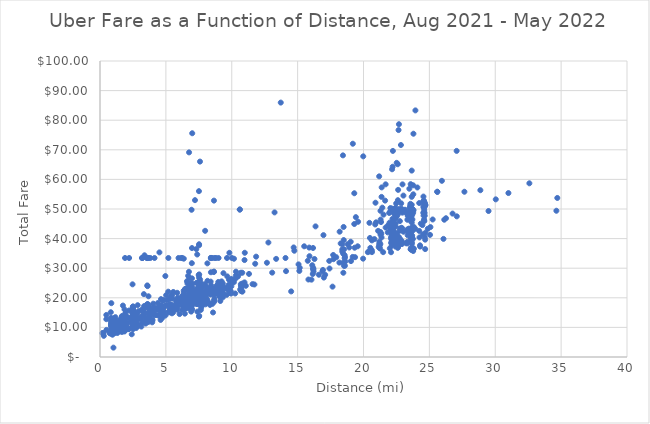
| Category |  Total Trip Fare in Local Currency  |
|---|---|
| 7.64 | 17.95 |
| 6.57 | 20.25 |
| 7.55 | 21.31 |
| 7.53 | 21.56 |
| 7.5 | 18.25 |
| 7.59 | 66.02 |
| 8.05 | 19.68 |
| 23.7 | 42.55 |
| 7.54 | 18.28 |
| 6.35 | 19.85 |
| 9.79 | 26.1 |
| 9.63 | 23.35 |
| 1.63 | 8.63 |
| 3.69 | 14.93 |
| 7.54 | 18.25 |
| 1.64 | 8.76 |
| 6.76 | 18.14 |
| 3.71 | 15.23 |
| 7.47 | 18.1 |
| 7.54 | 20.12 |
| 7.48 | 19.96 |
| 4.02 | 14.55 |
| 23.36 | 42.28 |
| 7.6 | 26.15 |
| 7.56 | 19.94 |
| 5.51 | 19.76 |
| 9.13 | 21.84 |
| 5.51 | 16.84 |
| 9.79 | 23.63 |
| 22.94 | 43.45 |
| 7.53 | 20.53 |
| 16.99 | 26.83 |
| 16.88 | 28.92 |
| 7.54 | 19.82 |
| 2.52 | 13.73 |
| 7.57 | 19.38 |
| 16.36 | 44.13 |
| 0.49 | 9.15 |
| 0.48 | 14.21 |
| 7.48 | 19.45 |
| 1.71 | 8.85 |
| 7.48 | 17.89 |
| 7.72 | 20.89 |
| 7.48 | 20.25 |
| 14.51 | 22.16 |
| 5.8 | 19.35 |
| 7.32 | 20.23 |
| 7.8 | 21.97 |
| 23.65 | 46.28 |
| 7.6 | 20.66 |
| 9.82 | 35.2 |
| 7.53 | 13.89 |
| 9.0 | 23.31 |
| 0.82 | 15.12 |
| 0.89 | 8.05 |
| 21.87 | 44.51 |
| 10.32 | 28.83 |
| 3.16 | 13.29 |
| 7.52 | 23.59 |
| 5.48 | 15.25 |
| 20.43 | 35.67 |
| 7.55 | 19.94 |
| 18.47 | 28.46 |
| 5.46 | 16.59 |
| 7.37 | 17.87 |
| 7.38 | 34.63 |
| 13.25 | 48.85 |
| 7.39 | 18.64 |
| 7.45 | 18.19 |
| 23.68 | 49.61 |
| 16.05 | 26.13 |
| 8.14 | 22.29 |
| 7.38 | 22.24 |
| 8.18 | 23 |
| 7.36 | 19.48 |
| 22.76 | 39.97 |
| 7.45 | 21.08 |
| 7.38 | 21.78 |
| 7.35 | 22.7 |
| 25.95 | 59.52 |
| 9.0 | 23.28 |
| 9.18 | 23.67 |
| 7.34 | 17.98 |
| 7.36 | 20.94 |
| 6.38 | 18.22 |
| 1.55 | 12.5 |
| 23.5 | 48.98 |
| 10.78 | 22.17 |
| 4.67 | 15.51 |
| 22.67 | 49.46 |
| 1.65 | 8.52 |
| 5.97 | 18.57 |
| 6.23 | 19.68 |
| 23.66 | 42.92 |
| 23.33 | 46.37 |
| 22.37 | 38.7 |
| 6.91 | 18.18 |
| 3.38 | 34.36 |
| 3.64 | 17.8 |
| 18.46 | 31.9 |
| 18.39 | 35.61 |
| 0.83 | 13.21 |
| 6.19 | 19.05 |
| 7.48 | 20.22 |
| 22.14 | 43.56 |
| 21.2 | 38.93 |
| 4.29 | 15.93 |
| 7.57 | 19.55 |
| 9.26 | 24.37 |
| 23.33 | 42.79 |
| 9.03 | 21.29 |
| 6.4 | 20.53 |
| 1.13 | 12.58 |
| 7.48 | 18.3 |
| 23.5 | 42.45 |
| 23.35 | 41.14 |
| 7.52 | 19.36 |
| 7.5 | 19.45 |
| 22.26 | 43.9 |
| 8.35 | 21.65 |
| 8.65 | 19.14 |
| 23.68 | 40.61 |
| 7.52 | 20.76 |
| 7.57 | 19.28 |
| 18.52 | 30.81 |
| 2.64 | 14.93 |
| 4.55 | 17.01 |
| 2.69 | 14.78 |
| 4.23 | 14.25 |
| 23.94 | 83.31 |
| 7.95 | 18.8 |
| 22.6 | 38.1 |
| 7.5 | 19.01 |
| 23.71 | 50.05 |
| 22.62 | 37.86 |
| 7.63 | 25.13 |
| 7.51 | 13.67 |
| 22.69 | 78.64 |
| 6.33 | 17.78 |
| 23.65 | 38.85 |
| 7.52 | 18.75 |
| 7.47 | 18.14 |
| 23.52 | 42.28 |
| 22.89 | 38.9 |
| 8.64 | 28.72 |
| 8.39 | 21.08 |
| 7.53 | 19.05 |
| 6.69 | 27.42 |
| 22.26 | 41.43 |
| 10.97 | 25.2 |
| 8.41 | 23.37 |
| 22.59 | 39.32 |
| 8.65 | 28.86 |
| 6.68 | 17.91 |
| 1.14 | 11.27 |
| 18.59 | 33.76 |
| 2.77 | 11.56 |
| 1.01 | 13.06 |
| 0.95 | 7.53 |
| 7.95 | 19.1 |
| 23.68 | 43.74 |
| 0.88 | 8.05 |
| 6.24 | 17.79 |
| 3.47 | 11.3 |
| 6.82 | 17.35 |
| 7.64 | 19.48 |
| 23.34 | 43.08 |
| 7.35 | 18.73 |
| 22.5 | 47.36 |
| 6.37 | 16.62 |
| 6.34 | 17.48 |
| 0.88 | 11.02 |
| 0.83 | 8.96 |
| 23.69 | 41.04 |
| 7.52 | 25.33 |
| 4.73 | 16.59 |
| 7.58 | 21.56 |
| 10.69 | 22.54 |
| 22.95 | 48.76 |
| 10.8 | 24.17 |
| 7.66 | 23.97 |
| 6.34 | 19.47 |
| 6.76 | 17.96 |
| 23.61 | 41.39 |
| 9.66 | 27.24 |
| 7.5 | 20.42 |
| 23.64 | 47.54 |
| 0.88 | 11.06 |
| 7.24 | 18.67 |
| 5.62 | 16.19 |
| 1.89 | 12.02 |
| 5.78 | 18.7 |
| 1.86 | 8.64 |
| 1.85 | 8.83 |
| 7.52 | 26.77 |
| 20.49 | 40.21 |
| 7.44 | 20.82 |
| 23.36 | 47.67 |
| 0.21 | 8.05 |
| 1.0 | 12.66 |
| 5.11 | 19.25 |
| 2.46 | 12.44 |
| 24.35 | 45.05 |
| 5.68 | 17.2 |
| 7.74 | 19.94 |
| 7.39 | 18.19 |
| 6.36 | 18.18 |
| 7.7 | 21.92 |
| 6.75 | 18.34 |
| 23.7 | 48.11 |
| 3.6 | 13.01 |
| 7.52 | 37.75 |
| 6.77 | 16.91 |
| 7.47 | 20.35 |
| 22.2 | 46.67 |
| 22.89 | 50.1 |
| 7.52 | 19.84 |
| 7.48 | 20.91 |
| 21.11 | 42.62 |
| 17.42 | 29.9 |
| 4.69 | 14.44 |
| 34.64 | 49.41 |
| 21.68 | 43.73 |
| 16.21 | 28.88 |
| 7.08 | 18.44 |
| 1.65 | 12.5 |
| 22.11 | 39.95 |
| 19.3 | 55.32 |
| 7.44 | 20.37 |
| 7.53 | 20.42 |
| 7.47 | 20.87 |
| 1.78 | 11.97 |
| 1.63 | 10.83 |
| 3.68 | 20.51 |
| 6.37 | 21.05 |
| 9.76 | 24.33 |
| 5.87 | 15.98 |
| 3.76 | 16.85 |
| 7.57 | 20.93 |
| 7.53 | 21.67 |
| 23.51 | 43.13 |
| 22.6 | 48.64 |
| 7.33 | 20.11 |
| 5.46 | 14.76 |
| 5.3 | 15.61 |
| 19.18 | 33.81 |
| 2.86 | 17.5 |
| 19.56 | 37.4 |
| 1.7 | 10.8 |
| 1.72 | 11.38 |
| 7.53 | 19.86 |
| 13.07 | 28.5 |
| 18.52 | 36.39 |
| 0.99 | 12.83 |
| 1.72 | 11.38 |
| 5.3 | 15.87 |
| 5.29 | 16.92 |
| 20.95 | 45.49 |
| 2.46 | 11.58 |
| 2.62 | 11.21 |
| 7.6 | 19.89 |
| 6.27 | 19.55 |
| 6.27 | 17.35 |
| 0.83 | 7.89 |
| 0.88 | 8.17 |
| 5.59 | 15.75 |
| 7.57 | 19.38 |
| 7.47 | 18.72 |
| 22.35 | 41.71 |
| 24.65 | 40.45 |
| 7.52 | 18.62 |
| 2.44 | 12.37 |
| 7.51 | 19.42 |
| 23.64 | 40.29 |
| 3.97 | 12.59 |
| 24.23 | 42.59 |
| 6.49 | 16.48 |
| 6.5 | 16.68 |
| 7.62 | 18.69 |
| 7.53 | 19.38 |
| 7.51 | 56.03 |
| 7.54 | 20.52 |
| 7.61 | 18.8 |
| 18.59 | 30.83 |
| 22.13 | 40.54 |
| 22.61 | 38.86 |
| 5.55 | 15.08 |
| 10.97 | 32.75 |
| 5.3 | 17.66 |
| 16.61 | 27.79 |
| 23.62 | 40.34 |
| 1.71 | 12.14 |
| 1.67 | 9.47 |
| 16.2 | 29.71 |
| 22.61 | 38.64 |
| 10.26 | 21.46 |
| 9.74 | 22.48 |
| 22.25 | 39.65 |
| 6.66 | 18.55 |
| 20.83 | 39.84 |
| 24.5 | 41.42 |
| 3.14 | 10.28 |
| 7.54 | 20.46 |
| 20.52 | 36.86 |
| 23.34 | 38.97 |
| 7.5 | 25.46 |
| 7.5 | 20.76 |
| 7.53 | 19.29 |
| 15.16 | 30.14 |
| 2.06 | 11.58 |
| 22.14 | 38.57 |
| 22.89 | 38.6 |
| 7.52 | 18.39 |
| 7.54 | 18.25 |
| 7.39 | 15.34 |
| 23.75 | 39.88 |
| 7.52 | 18.45 |
| 2.46 | 12.58 |
| 2.49 | 10.36 |
| 7.59 | 19.13 |
| 22.18 | 39.08 |
| 1.36 | 8.61 |
| 1.47 | 10.8 |
| 22.61 | 38.08 |
| 7.29 | 19.96 |
| 7.52 | 19.23 |
| 7.43 | 18.88 |
| 2.23 | 11.73 |
| 7.73 | 20.19 |
| 18.62 | 32.27 |
| 22.1 | 38.54 |
| 0.88 | 8.05 |
| 22.6 | 36.89 |
| 0.92 | 8.05 |
| 7.51 | 19.3 |
| 22.13 | 40.53 |
| 6.36 | 17.1 |
| 6.77 | 16.67 |
| 23.62 | 38.89 |
| 7.52 | 19.21 |
| 7.51 | 18.51 |
| 22.17 | 40.4 |
| 23.24 | 38.42 |
| 22.42 | 37.31 |
| 21.22 | 37.51 |
| 7.64 | 19.59 |
| 7.43 | 18.63 |
| 22.15 | 38.86 |
| 0.88 | 10.08 |
| 0.94 | 8.05 |
| 2.75 | 12.01 |
| 0.87 | 10.8 |
| 20.64 | 35.43 |
| 0.84 | 10.39 |
| 7.52 | 19.64 |
| 7.68 | 19.34 |
| 0.92 | 11.35 |
| 22.56 | 38.94 |
| 0.85 | 10.84 |
| 5.55 | 17.17 |
| 3.66 | 11.82 |
| 5.3 | 16.51 |
| 3.77 | 13.47 |
| 1.3 | 11.35 |
| 1.32 | 8.1 |
| 6.36 | 18.13 |
| 9.11 | 24.6 |
| 6.75 | 18.16 |
| 9.26 | 21.13 |
| 1.84 | 9.96 |
| 20.63 | 36.06 |
| 5.86 | 21.69 |
| 10.72 | 22.97 |
| 0.93 | 12.07 |
| 22.29 | 42.39 |
| 0.85 | 10.89 |
| 1.67 | 13.82 |
| 22.43 | 38.97 |
| 1.76 | 13.31 |
| 21.19 | 38.11 |
| 22.88 | 39.32 |
| 10.99 | 35.21 |
| 7.48 | 20.16 |
| 22.27 | 40.69 |
| 2.46 | 10.17 |
| 6.27 | 17.8 |
| 2.51 | 10.52 |
| 22.62 | 38.53 |
| 6.25 | 20.67 |
| 7.0 | 20.04 |
| 7.52 | 20.47 |
| 7.53 | 20.9 |
| 2.82 | 11.01 |
| 2.89 | 10.49 |
| 22.14 | 39.19 |
| 6.78 | 17.96 |
| 7.69 | 18.76 |
| 6.76 | 17.96 |
| 23.6 | 40.44 |
| 8.03 | 21.06 |
| 7.77 | 21.03 |
| 0.88 | 10.93 |
| 0.89 | 8.05 |
| 7.47 | 20.35 |
| 22.13 | 40.09 |
| 5.77 | 17.55 |
| 5.29 | 17.48 |
| 20.33 | 35.42 |
| 7.53 | 21.12 |
| 3.59 | 24.18 |
| 7.55 | 22.82 |
| 22.19 | 45.51 |
| 22.6 | 48.12 |
| 6.4 | 15.99 |
| 3.61 | 16.68 |
| 1.14 | 8.44 |
| 0.88 | 8.05 |
| 3.57 | 17.78 |
| 2.75 | 9.8 |
| 19.59 | 45.68 |
| 2.47 | 24.55 |
| 22.24 | 42.91 |
| 25.05 | 41.26 |
| 6.99 | 19.52 |
| 22.12 | 40.06 |
| 7.96 | 20.27 |
| 22.92 | 38.17 |
| 2.63 | 12.12 |
| 2.71 | 10.73 |
| 3.61 | 23.94 |
| 23.63 | 42.41 |
| 6.36 | 33.22 |
| 1.11 | 8.05 |
| 6.75 | 28.79 |
| 0.26 | 8.05 |
| 26.07 | 39.9 |
| 0.77 | 8.05 |
| 7.17 | 20.32 |
| 7.42 | 20.51 |
| 9.97 | 23.86 |
| 2.46 | 13.12 |
| 9.86 | 21.8 |
| 2.5 | 16.42 |
| 22.2 | 38.77 |
| 7.51 | 19.78 |
| 11.07 | 24.06 |
| 22.17 | 39.04 |
| 21.49 | 35.42 |
| 23.67 | 40.11 |
| 8.4 | 25.46 |
| 9.23 | 25.54 |
| 9.27 | 23.65 |
| 23.63 | 39.75 |
| 1.64 | 9.31 |
| 9.32 | 20.14 |
| 22.0 | 36.72 |
| 6.98 | 24.77 |
| 7.6 | 19.48 |
| 22.09 | 35.39 |
| 8.44 | 24.21 |
| 23.61 | 40.46 |
| 8.45 | 22.94 |
| 6.5 | 19.42 |
| 7.61 | 21.41 |
| 7.56 | 21.79 |
| 7.45 | 20.53 |
| 22.24 | 39.85 |
| 2.02 | 10.53 |
| 7.56 | 19.05 |
| 2.16 | 9.56 |
| 0.86 | 18.19 |
| 1.64 | 13 |
| 22.63 | 37.32 |
| 0.91 | 11.05 |
| 7.42 | 20.63 |
| 7.52 | 20.44 |
| 7.67 | 20.85 |
| 7.51 | 21.13 |
| 22.24 | 40.58 |
| 6.37 | 21.74 |
| 1.71 | 9.41 |
| 2.17 | 9.49 |
| 6.75 | 19.61 |
| 1.71 | 10.3 |
| 22.26 | 38.65 |
| 7.08 | 20.05 |
| 7.62 | 19.72 |
| 7.42 | 21.67 |
| 7.53 | 20.42 |
| 18.46 | 34.9 |
| 22.13 | 41.85 |
| 22.6 | 37.07 |
| 8.14 | 19.39 |
| 22.26 | 40.09 |
| 22.89 | 39.04 |
| 22.14 | 40.95 |
| 6.36 | 18.21 |
| 6.75 | 23.39 |
| 23.68 | 38.35 |
| 22.67 | 40.64 |
| 19.42 | 47.25 |
| 22.13 | 40.5 |
| 23.33 | 38.4 |
| 9.32 | 24.83 |
| 0.9 | 12.17 |
| 0.18 | 8.05 |
| 9.26 | 23.26 |
| 22.32 | 44.4 |
| 22.63 | 56.46 |
| 2.53 | 15.49 |
| 25.08 | 43.89 |
| 2.5 | 16.42 |
| 22.15 | 37.79 |
| 21.26 | 36.63 |
| 5.27 | 17.69 |
| 7.6 | 20.52 |
| 22.46 | 48.96 |
| 22.18 | 50.12 |
| 7.24 | 20.59 |
| 7.13 | 19.59 |
| 7.77 | 19.64 |
| 24.23 | 52.01 |
| 22.48 | 51.88 |
| 5.41 | 16.95 |
| 5.29 | 19.6 |
| 6.99 | 19.73 |
| 22.39 | 39.92 |
| 22.03 | 49.14 |
| 7.66 | 19.98 |
| 2.48 | 11.26 |
| 7.05 | 18.39 |
| 6.88 | 18.54 |
| 7.55 | 19.62 |
| 7.64 | 18.55 |
| 21.3 | 46.42 |
| 2.41 | 7.68 |
| 22.23 | 69.62 |
| 22.44 | 45.09 |
| 16.18 | 30.11 |
| 6.37 | 17.43 |
| 6.75 | 18.01 |
| 16.96 | 41.17 |
| 18.39 | 38.11 |
| 21.38 | 57.3 |
| 2.63 | 13.9 |
| 2.71 | 10.92 |
| 24.29 | 37.72 |
| 2.18 | 9.42 |
| 5.02 | 20.88 |
| 7.96 | 20.3 |
| 2.52 | 15.1 |
| 2.51 | 14.36 |
| 22.21 | 64.27 |
| 8.18 | 18.32 |
| 4.6 | 12.52 |
| 9.34 | 23.88 |
| 7.02 | 18.76 |
| 22.77 | 42.7 |
| 21.84 | 42.1 |
| 9.94 | 21.44 |
| 7.14 | 20.39 |
| 0.74 | 8.05 |
| 1.71 | 9.24 |
| 9.08 | 22.43 |
| 4.66 | 14.32 |
| 1.72 | 12.97 |
| 3.61 | 12.97 |
| 6.98 | 18.54 |
| 21.29 | 41.32 |
| 7.65 | 21.56 |
| 8.21 | 18.6 |
| 8.22 | 21.34 |
| 23.48 | 48.27 |
| 6.37 | 16.95 |
| 6.75 | 17.71 |
| 7.06 | 19.05 |
| 0.85 | 8.31 |
| 7.18 | 19.48 |
| 6.99 | 18.57 |
| 0.84 | 12.18 |
| 22.17 | 63.42 |
| 21.33 | 45.59 |
| 9.61 | 20.99 |
| 9.92 | 22.31 |
| 7.71 | 19.13 |
| 2.82 | 14.65 |
| 23.03 | 42.32 |
| 7.62 | 19.98 |
| 0.88 | 12.87 |
| 22.4 | 46.62 |
| 4.97 | 14.05 |
| 1.67 | 11.89 |
| 6.96 | 21.1 |
| 7.52 | 21.12 |
| 7.43 | 19.46 |
| 2.51 | 14.28 |
| 0.84 | 11.5 |
| 7.29 | 22.64 |
| 2.51 | 10.24 |
| 6.36 | 18.97 |
| 7.44 | 21.74 |
| 4.65 | 16.23 |
| 1.16 | 12.64 |
| 7.55 | 18.87 |
| 1.51 | 12.13 |
| 15.07 | 31.29 |
| 22.15 | 42.79 |
| 8.92 | 21.33 |
| 4.6 | 13.67 |
| 6.99 | 24.64 |
| 2.04 | 13.64 |
| 21.98 | 45.39 |
| 1.3 | 9.36 |
| 8.58 | 23.17 |
| 0.95 | 8.05 |
| 6.85 | 22.89 |
| 6.64 | 24.8 |
| 22.13 | 42.94 |
| 1.08 | 9.61 |
| 7.0 | 18.6 |
| 7.54 | 19.96 |
| 6.69 | 17.39 |
| 21.37 | 40.38 |
| 7.35 | 17.96 |
| 6.31 | 17.82 |
| 8.25 | 22.56 |
| 9.18 | 21.23 |
| 7.35 | 20.56 |
| 6.99 | 15.99 |
| 7.49 | 19.97 |
| 7.45 | 22.25 |
| 4.83 | 16.54 |
| 6.99 | 19.75 |
| 7.53 | 21.03 |
| 7.54 | 21.55 |
| 22.75 | 43.41 |
| 22.66 | 76.67 |
| 6.99 | 18.46 |
| 2.49 | 15.33 |
| 3.96 | 11.72 |
| 7.64 | 22.84 |
| 20.64 | 39.4 |
| 4.51 | 35.34 |
| 6.93 | 19.43 |
| 16.28 | 33.11 |
| 1.97 | 11.46 |
| 17.09 | 27.76 |
| 22.6 | 65.12 |
| 2.5 | 10.7 |
| 23.8 | 44.04 |
| 4.65 | 17.47 |
| 22.73 | 50.05 |
| 7.52 | 19.68 |
| 21.95 | 48.66 |
| 20.45 | 45.32 |
| 7.51 | 20.18 |
| 21.29 | 42.22 |
| 7.35 | 22.26 |
| 22.61 | 52.98 |
| 6.37 | 17.89 |
| 6.33 | 18.97 |
| 3.98 | 12.36 |
| 7.04 | 21.21 |
| 4.01 | 15.12 |
| 3.69 | 13.11 |
| 7.18 | 21.85 |
| 7.54 | 21.03 |
| 22.86 | 51.92 |
| 6.24 | 15.93 |
| 7.41 | 22.84 |
| 22.04 | 50.32 |
| 21.29 | 49.38 |
| 2.14 | 13.25 |
| 6.65 | 19.22 |
| 7.6 | 20.49 |
| 22.52 | 41.83 |
| 9.33 | 21.64 |
| 1.72 | 8.61 |
| 8.85 | 21.52 |
| 9.32 | 21.18 |
| 1.71 | 9.33 |
| 1.62 | 13.16 |
| 7.52 | 22.14 |
| 24.09 | 57.27 |
| 6.79 | 26.66 |
| 2.46 | 14.73 |
| 26.26 | 46.88 |
| 16.15 | 28.04 |
| 17.93 | 33.72 |
| 7.51 | 20.53 |
| 17.4 | 32.46 |
| 6.6 | 25.59 |
| 8.69 | 19.64 |
| 22.17 | 43.41 |
| 1.9 | 33.45 |
| 1.96 | 13.54 |
| 7.09 | 18.52 |
| 2.53 | 13.88 |
| 22.84 | 71.62 |
| 2.51 | 9.44 |
| 7.52 | 20.74 |
| 24.47 | 44.56 |
| 7.51 | 18.76 |
| 7.54 | 19.66 |
| 22.16 | 44.83 |
| 21.28 | 38.17 |
| 7.09 | 22.14 |
| 7.55 | 21.72 |
| 22.76 | 45.91 |
| 7.41 | 19.18 |
| 6.51 | 19.87 |
| 22.75 | 49.44 |
| 6.56 | 18.64 |
| 1.69 | 12.95 |
| 4.66 | 17.27 |
| 24.25 | 40.39 |
| 1.71 | 10.08 |
| 6.98 | 18.57 |
| 8.0 | 17.79 |
| 7.67 | 22.11 |
| 7.95 | 24.58 |
| 7.48 | 19.63 |
| 22.42 | 50.37 |
| 7.82 | 21.82 |
| 8.53 | 17.95 |
| 7.52 | 20.43 |
| 22.88 | 43.66 |
| 11.31 | 28.07 |
| 7.56 | 22.92 |
| 22.04 | 43.28 |
| 7.54 | 19.66 |
| 9.0 | 33.45 |
| 7.51 | 19.76 |
| 8.64 | 21.01 |
| 7.46 | 20.05 |
| 3.21 | 15.63 |
| 7.52 | 22.24 |
| 27.66 | 55.83 |
| 2.51 | 17.1 |
| 4.49 | 14.11 |
| 7.54 | 20.85 |
| 18.49 | 43.93 |
| 14.08 | 33.45 |
| 6.76 | 21.71 |
| 6.95 | 49.74 |
| 17.65 | 23.77 |
| 5.02 | 17.55 |
| 9.02 | 22.28 |
| 7.0 | 18.94 |
| 28.87 | 56.35 |
| 8.4 | 22.63 |
| 16.92 | 29.41 |
| 7.53 | 21.09 |
| 21.43 | 50.45 |
| 6.57 | 19.96 |
| 1.72 | 10.07 |
| 18.92 | 37 |
| 3.21 | 14.02 |
| 6.76 | 18.94 |
| 1.89 | 11.38 |
| 4.03 | 15.1 |
| 5.87 | 18.37 |
| 22.96 | 58.32 |
| 7.28 | 19.37 |
| 7.43 | 20.38 |
| 24.71 | 51.32 |
| 6.36 | 17.63 |
| 6.75 | 18.39 |
| 6.99 | 19.47 |
| 7.53 | 20.69 |
| 4.65 | 14.37 |
| 22.84 | 49.77 |
| 7.5 | 20.79 |
| 22.5 | 47.58 |
| 7.0 | 22.87 |
| 9.97 | 26.27 |
| 23.25 | 48.78 |
| 7.45 | 22.25 |
| 23.15 | 49.75 |
| 7.54 | 19.23 |
| 9.01 | 21.79 |
| 7.51 | 21.17 |
| 8.8 | 33.45 |
| 7.03 | 20.14 |
| 7.52 | 21.88 |
| 22.57 | 40.14 |
| 24.88 | 43.32 |
| 2.5 | 10.73 |
| 2.72 | 12.73 |
| 7.52 | 38.09 |
| 30.04 | 53.26 |
| 3.98 | 16.36 |
| 2.5 | 14.87 |
| 3.97 | 14.85 |
| 4.4 | 16.02 |
| 4.29 | 16.57 |
| 6.04 | 19.54 |
| 6.62 | 19.66 |
| 22.26 | 43.96 |
| 6.65 | 19.23 |
| 4.64 | 14.98 |
| 6.75 | 19.16 |
| 22.52 | 41.52 |
| 29.49 | 49.32 |
| 7.39 | 20.6 |
| 10.7 | 22.3 |
| 10.81 | 22.12 |
| 7.0 | 19 |
| 7.55 | 20.89 |
| 9.97 | 26.27 |
| 23.45 | 43.38 |
| 7.32 | 25.06 |
| 7.38 | 20.81 |
| 6.36 | 17.64 |
| 6.6 | 18.55 |
| 6.98 | 19.57 |
| 12.67 | 31.84 |
| 7.53 | 24.41 |
| 24.56 | 47.8 |
| 7.29 | 20.91 |
| 11.58 | 24.62 |
| 21.15 | 37.14 |
| 6.98 | 19.53 |
| 8.16 | 25.73 |
| 6.43 | 18.1 |
| 24.62 | 50.64 |
| 2.95 | 13.35 |
| 1.16 | 9.92 |
| 11.78 | 31.5 |
| 19.19 | 72.05 |
| 7.4 | 21.42 |
| 7.51 | 20.01 |
| 6.58 | 18.07 |
| 26.76 | 48.45 |
| 7.51 | 23.13 |
| 24.59 | 46.08 |
| 6.94 | 20.95 |
| 7.31 | 36.46 |
| 4.63 | 19.55 |
| 5.41 | 20.46 |
| 5.42 | 17.72 |
| 3.58 | 16.91 |
| 25.6 | 55.81 |
| 23.62 | 46.98 |
| 3.35 | 16.47 |
| 2.68 | 13.37 |
| 25.6 | 55.81 |
| 0.88 | 9.5 |
| 15.88 | 36.97 |
| 0.86 | 10.56 |
| 6.62 | 16.5 |
| 6.52 | 23.05 |
| 4.74 | 13.27 |
| 24.56 | 48.75 |
| 22.52 | 65.59 |
| 6.94 | 19.96 |
| 18.27 | 38.36 |
| 7.88 | 18.91 |
| 7.51 | 25.21 |
| 7.53 | 20.27 |
| 23.93 | 43.31 |
| 4.39 | 18.23 |
| 7.53 | 22.06 |
| 8.65 | 52.83 |
| 6.36 | 18.78 |
| 8.08 | 23.78 |
| 4.85 | 15.29 |
| 6.75 | 18.41 |
| 5.22 | 15.31 |
| 23.55 | 50.98 |
| 3.35 | 17.21 |
| 6.58 | 22.78 |
| 7.0 | 20.1 |
| 3.33 | 21.24 |
| 7.54 | 22.13 |
| 9.19 | 24.09 |
| 9.27 | 22.92 |
| 7.54 | 20.3 |
| 24.62 | 45.95 |
| 19.98 | 67.79 |
| 7.51 | 19.51 |
| 16.17 | 29.68 |
| 8.41 | 33.45 |
| 10.69 | 24.59 |
| 2.93 | 15.49 |
| 10.81 | 24.8 |
| 6.63 | 19.52 |
| 8.67 | 33.45 |
| 18.17 | 31.89 |
| 3.61 | 17.82 |
| 7.53 | 20.73 |
| 23.53 | 46.26 |
| 6.97 | 31.7 |
| 7.61 | 20.39 |
| 6.24 | 33.45 |
| 10.61 | 49.82 |
| 7.42 | 22.63 |
| 5.19 | 33.45 |
| 4.96 | 27.35 |
| 1.74 | 17.38 |
| 7.54 | 23.25 |
| 25.25 | 46.46 |
| 10.61 | 49.82 |
| 6.9 | 24.33 |
| 34.71 | 53.73 |
| 6.82 | 20.07 |
| 24.7 | 41.98 |
| 7.85 | 23.77 |
| 8.73 | 22.41 |
| 7.51 | 21.83 |
| 3.34 | 15.15 |
| 3.35 | 14.06 |
| 2.95 | 13.04 |
| 11.72 | 24.5 |
| 6.92 | 24.95 |
| 16.17 | 36.83 |
| 7.54 | 19.76 |
| 11.85 | 33.9 |
| 23.48 | 56.85 |
| 3.67 | 14.36 |
| 22.18 | 49.06 |
| 7.56 | 21.62 |
| 23.03 | 54.53 |
| 10.7 | 23.94 |
| 8.98 | 25.35 |
| 6.36 | 17.62 |
| 6.94 | 17.57 |
| 2.49 | 12.53 |
| 1.17 | 13.46 |
| 7.68 | 16.66 |
| 10.8 | 28.46 |
| 7.52 | 20.71 |
| 23.57 | 50.25 |
| 6.73 | 21.08 |
| 0.91 | 12.79 |
| 8.83 | 23.51 |
| 2.51 | 13.54 |
| 13.72 | 85.95 |
| 7.44 | 18.43 |
| 24.6 | 46.51 |
| 6.94 | 20.07 |
| 10.69 | 28.47 |
| 7.66 | 18.84 |
| 6.98 | 22.36 |
| 10.17 | 33.2 |
| 7.51 | 22.57 |
| 6.36 | 20.07 |
| 8.43 | 33.45 |
| 6.77 | 18.69 |
| 8.06 | 21.08 |
| 23.78 | 36.36 |
| 1.46 | 10.44 |
| 9.09 | 20.44 |
| 1.34 | 8.59 |
| 10.16 | 25.26 |
| 10.01 | 33.45 |
| 3.22 | 33.45 |
| 3.36 | 11.96 |
| 7.75 | 17.45 |
| 6.04 | 14.51 |
| 7.03 | 19.11 |
| 4.92 | 17.14 |
| 3.17 | 15.94 |
| 24.57 | 50.5 |
| 3.77 | 16.17 |
| 5.37 | 16.25 |
| 5.38 | 17.26 |
| 0.93 | 8.59 |
| 1.72 | 10.88 |
| 4.59 | 16.87 |
| 4.65 | 16.46 |
| 23.78 | 54.96 |
| 7.84 | 21.44 |
| 18.5 | 39.51 |
| 32.59 | 58.68 |
| 3.08 | 12.8 |
| 5.96 | 33.45 |
| 6.45 | 18.1 |
| 26.13 | 46.38 |
| 18.57 | 33.34 |
| 4.63 | 15.46 |
| 6.96 | 16.35 |
| 10.38 | 26.93 |
| 10.31 | 27.52 |
| 24.55 | 50.82 |
| 4.04 | 18.02 |
| 7.84 | 19.43 |
| 7.52 | 21.72 |
| 3.22 | 33.45 |
| 6.99 | 17.43 |
| 3.18 | 33.45 |
| 4.66 | 16.63 |
| 27.08 | 47.52 |
| 24.55 | 48.72 |
| 4.09 | 16.73 |
| 7.37 | 19.66 |
| 8.9 | 22.26 |
| 6.36 | 18.64 |
| 6.75 | 17.48 |
| 7.0 | 18.35 |
| 1.89 | 14.04 |
| 5.91 | 20.07 |
| 23.51 | 46.75 |
| 4.14 | 33.45 |
| 7.39 | 23.15 |
| 14.75 | 35.9 |
| 2.52 | 12.17 |
| 4.68 | 13.7 |
| 7.51 | 24.07 |
| 23.5 | 50.32 |
| 2.69 | 15.05 |
| 7.54 | 19.35 |
| 7.55 | 21.68 |
| 8.42 | 33.45 |
| 7.58 | 21.24 |
| 15.77 | 32.5 |
| 6.98 | 18.48 |
| 9.64 | 33.45 |
| 6.98 | 36.81 |
| 7.27 | 22.11 |
| 12.78 | 38.68 |
| 7.84 | 21.39 |
| 7.5 | 22.42 |
| 9.97 | 25.06 |
| 6.41 | 19.44 |
| 23.81 | 36.6 |
| 18.8 | 38.13 |
| 0.48 | 12.78 |
| 23.57 | 47.8 |
| 5.18 | 22.07 |
| 24.68 | 36.46 |
| 5.92 | 17.14 |
| 7.34 | 20.27 |
| 23.66 | 51.42 |
| 7.59 | 22.67 |
| 23.65 | 36.45 |
| 8.91 | 24.15 |
| 23.31 | 48.35 |
| 1.22 | 8.59 |
| 0.98 | 12.06 |
| 7.7 | 21.45 |
| 7.08 | 20.03 |
| 7.52 | 23.69 |
| 22.38 | 47.93 |
| 23.71 | 46.47 |
| 7.44 | 23.31 |
| 7.63 | 21.01 |
| 24.68 | 39.64 |
| 6.36 | 19.55 |
| 6.75 | 19.16 |
| 19.3 | 44.93 |
| 6.75 | 23.58 |
| 4.82 | 19.28 |
| 7.54 | 24.37 |
| 1.86 | 16.09 |
| 24.67 | 51.95 |
| 1.93 | 14.87 |
| 5.41 | 20.57 |
| 7.56 | 18.8 |
| 23.58 | 58.39 |
| 7.63 | 20.44 |
| 6.35 | 22.39 |
| 6.99 | 20.03 |
| 2.52 | 15.56 |
| 13.37 | 33.15 |
| 24.55 | 54.2 |
| 27.07 | 69.63 |
| 3.5 | 12.95 |
| 23.61 | 36.9 |
| 8.08 | 22.68 |
| 8.5 | 21.45 |
| 5.21 | 15.06 |
| 8.48 | 33.45 |
| 18.19 | 42.34 |
| 6.98 | 26.57 |
| 3.69 | 33.45 |
| 2.49 | 15.44 |
| 23.56 | 51.74 |
| 3.57 | 33.45 |
| 2.49 | 16.95 |
| 1.7 | 10.58 |
| 7.83 | 20.29 |
| 6.84 | 22.39 |
| 15.9 | 34.06 |
| 23.77 | 58 |
| 23.58 | 50.8 |
| 23.77 | 36.26 |
| 18.39 | 36.36 |
| 8.89 | 24.21 |
| 7.0 | 75.59 |
| 23.66 | 54.11 |
| 10.24 | 26.33 |
| 5.49 | 21.1 |
| 9.4 | 22.95 |
| 23.78 | 36.61 |
| 8.66 | 18.62 |
| 17.7 | 34.47 |
| 7.0 | 23.6 |
| 3.56 | 33.45 |
| 24.64 | 50.87 |
| 21.37 | 54.09 |
| 3.82 | 33.45 |
| 9.25 | 21.38 |
| 7.59 | 20.3 |
| 23.77 | 48.72 |
| 8.91 | 24.33 |
| 9.37 | 28.31 |
| 6.93 | 20.44 |
| 24.64 | 48.7 |
| 7.54 | 19.98 |
| 7.44 | 21.56 |
| 10.48 | 27.28 |
| 23.58 | 36.39 |
| 2.49 | 12.65 |
| 7.66 | 21.2 |
| 6.33 | 20.77 |
| 21.35 | 41.63 |
| 6.99 | 19.1 |
| 21.68 | 58.33 |
| 24.61 | 49.66 |
| 21.19 | 61.03 |
| 17.72 | 33.04 |
| 3.15 | 11.33 |
| 7.84 | 19.89 |
| 7.6 | 19.18 |
| 23.77 | 35.81 |
| 7.55 | 22.78 |
| 23.66 | 62.98 |
| 4.78 | 19 |
| 7.5 | 18.18 |
| 7.53 | 27.9 |
| 23.79 | 75.43 |
| 7.69 | 19.26 |
| 2.21 | 15.71 |
| 23.57 | 51.26 |
| 18.44 | 68.12 |
| 7.23 | 19.27 |
| 23.59 | 36.36 |
| 7.9 | 20.5 |
| 7.99 | 20.59 |
| 24.58 | 51.81 |
| 5.56 | 21.97 |
| 7.54 | 21.11 |
| 22.43 | 44.04 |
| 7.0 | 20.03 |
| 3.63 | 33.45 |
| 7.51 | 22.64 |
| 3.59 | 33.45 |
| 7.44 | 20.65 |
| 2.21 | 33.45 |
| 2.71 | 12.52 |
| 8.58 | 15.05 |
| 6.16 | 33.45 |
| 24.3 | 37.31 |
| 8.88 | 22.51 |
| 8.15 | 31.64 |
| 20.89 | 44.78 |
| 6.99 | 19.92 |
| 24.58 | 52.88 |
| 21.52 | 48.09 |
| 6.83 | 24.58 |
| 19.33 | 36.92 |
| 2.46 | 13.66 |
| 2.46 | 13.66 |
| 19.97 | 33.22 |
| 7.58 | 24.01 |
| 6.4 | 20.54 |
| 23.78 | 36.72 |
| 2.48 | 15.36 |
| 1.02 | 3.16 |
| 6.94 | 19.35 |
| 7.56 | 24.9 |
| 24.54 | 52.6 |
| 2.67 | 11.04 |
| 7.65 | 15.88 |
| 23.71 | 36.52 |
| 6.44 | 14.65 |
| 19.05 | 32.4 |
| 4.16 | 14.11 |
| 8.42 | 28.63 |
| 16.11 | 31.01 |
| 8.48 | 22.31 |
| 7.98 | 42.63 |
| 6.76 | 69.13 |
| 7.21 | 52.99 |
| 21.64 | 52.83 |
| 8.13 | 22.18 |
| 24.61 | 52.46 |
| 2.52 | 14.81 |
| 0.29 | 7.14 |
| 18.57 | 34.4 |
| 2.49 | 15.35 |
| 10.64 | 22.81 |
| 4.4 | 14.05 |
| 8.9 | 21.52 |
| 2.52 | 13.44 |
| 15.13 | 29.08 |
| 7.86 | 21.78 |
| 14.7 | 37.01 |
| 23.62 | 36.27 |
| 1.66 | 13.1 |
| 1.67 | 13.65 |
| 14.12 | 29 |
| 23.48 | 47.15 |
| 15.82 | 26.18 |
| 9.07 | 20.54 |
| 23.77 | 36.59 |
| 9.13 | 18.92 |
| 19.03 | 38.93 |
| 19.36 | 33.72 |
| 24.65 | 47.74 |
| 15.5 | 37.4 |
| 0.86 | 8.86 |
| 7.49 | 27.68 |
| 23.8 | 49.59 |
| 6.92 | 15.34 |
| 31.0 | 55.39 |
| 6.45 | 22.96 |
| 7.12 | 19.34 |
| 23.66 | 45.43 |
| 8.35 | 17.6 |
| 20.91 | 52.12 |